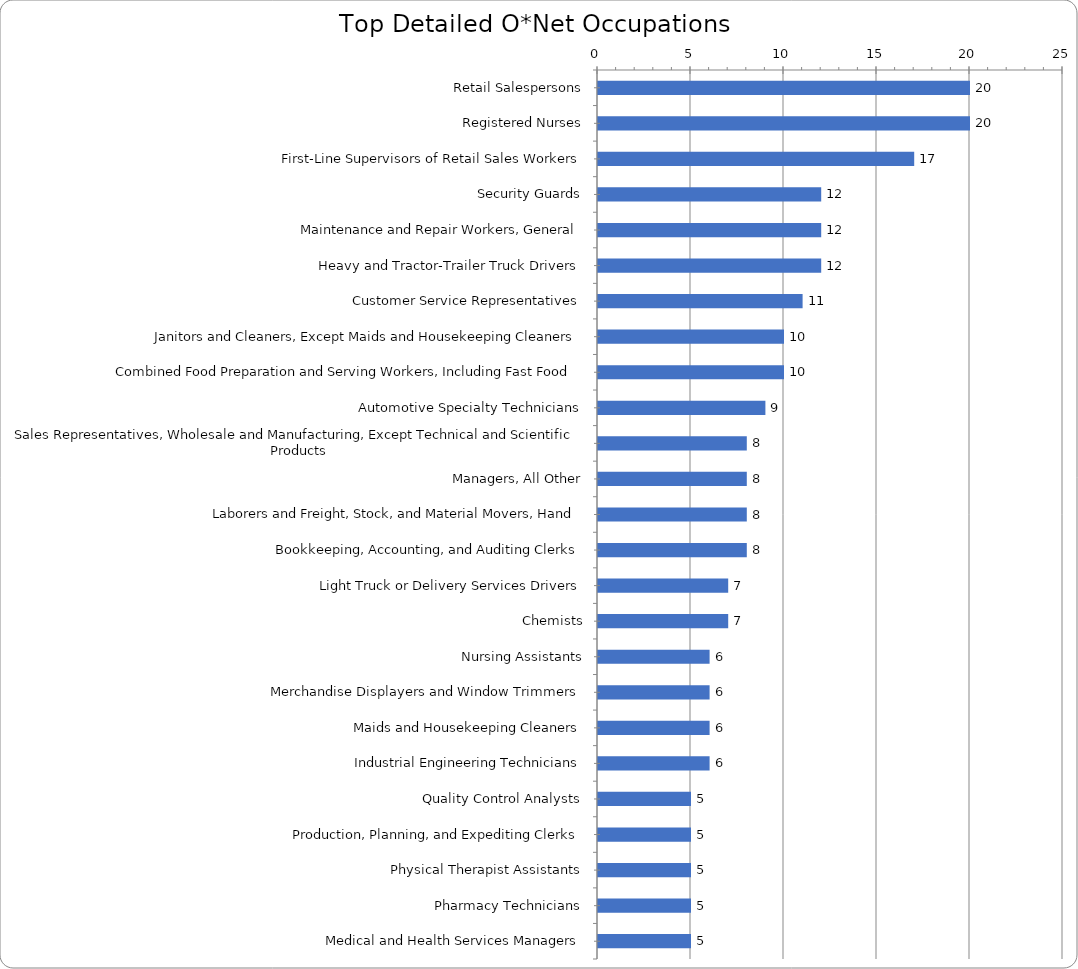
| Category | Series 0 |
|---|---|
| Retail Salespersons | 20 |
| Registered Nurses | 20 |
| First-Line Supervisors of Retail Sales Workers | 17 |
| Security Guards | 12 |
| Maintenance and Repair Workers, General | 12 |
| Heavy and Tractor-Trailer Truck Drivers | 12 |
| Customer Service Representatives | 11 |
| Janitors and Cleaners, Except Maids and Housekeeping Cleaners | 10 |
| Combined Food Preparation and Serving Workers, Including Fast Food | 10 |
| Automotive Specialty Technicians | 9 |
| Sales Representatives, Wholesale and Manufacturing, Except Technical and Scientific Products | 8 |
| Managers, All Other | 8 |
| Laborers and Freight, Stock, and Material Movers, Hand | 8 |
| Bookkeeping, Accounting, and Auditing Clerks | 8 |
| Light Truck or Delivery Services Drivers | 7 |
| Chemists | 7 |
| Nursing Assistants | 6 |
| Merchandise Displayers and Window Trimmers | 6 |
| Maids and Housekeeping Cleaners | 6 |
| Industrial Engineering Technicians | 6 |
| Quality Control Analysts | 5 |
| Production, Planning, and Expediting Clerks | 5 |
| Physical Therapist Assistants | 5 |
| Pharmacy Technicians | 5 |
| Medical and Health Services Managers | 5 |